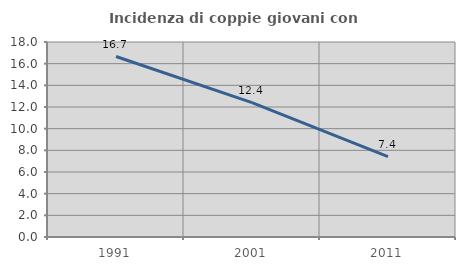
| Category | Incidenza di coppie giovani con figli |
|---|---|
| 1991.0 | 16.658 |
| 2001.0 | 12.41 |
| 2011.0 | 7.423 |